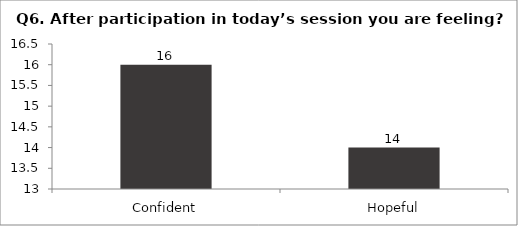
| Category | Q6. After participation in today’s session you are feeling? |
|---|---|
| Confident | 16 |
| Hopeful | 14 |